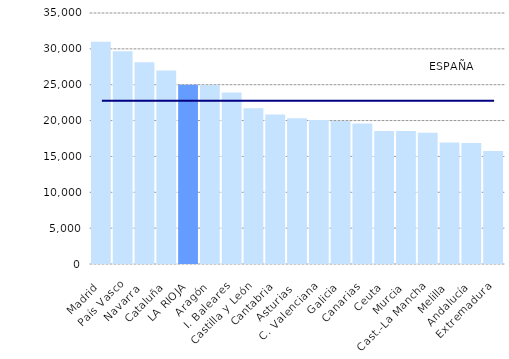
| Category | Series 1 |
|---|---|
| Madrid | 31004 |
| País Vasco | 29683 |
| Navarra  | 28124 |
| Cataluña | 26996 |
| LA RIOJA | 24998 |
| Aragón | 24957 |
| I. Baleares | 23931 |
| Castilla y León | 21727 |
| Cantabria | 20855 |
| Asturias  | 20334 |
| C. Valenciana | 20073 |
| Galicia | 19954 |
| Canarias | 19581 |
| Ceuta | 18550 |
| Murcia | 18529 |
| Cast.-La Mancha | 18307 |
| Melilla | 16941 |
| Andalucía | 16884 |
| Extremadura | 15752 |